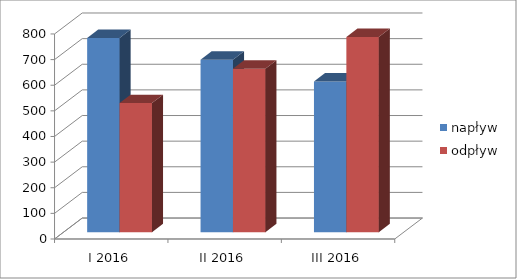
| Category | napływ | odpływ |
|---|---|---|
| I 2016 | 758 | 504 |
| II 2016 | 673 | 638 |
| III 2016 | 588 | 762 |